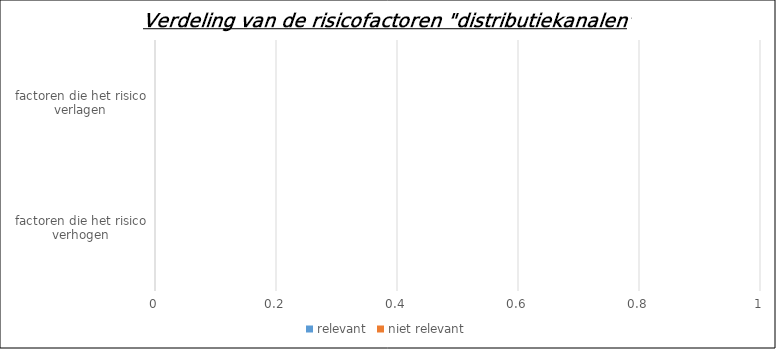
| Category | relevant | niet relevant |
|---|---|---|
| factoren die het risico verhogen | 0 | 0 |
| factoren die het risico verlagen | 0 | 0 |